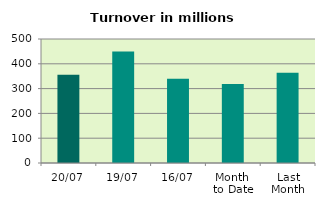
| Category | Series 0 |
|---|---|
| 20/07 | 356.327 |
| 19/07 | 450.031 |
| 16/07 | 339.348 |
| Month 
to Date | 318.999 |
| Last
Month | 364.182 |